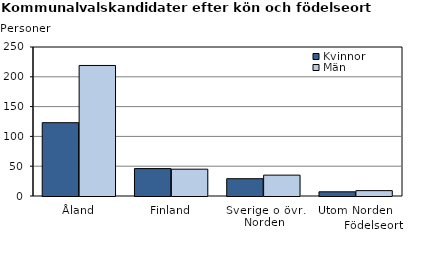
| Category | Kvinnor | Män |
|---|---|---|
| Åland | 123 | 219 |
| Finland | 46 | 45 |
| Sverige o övr. Norden | 29 | 35 |
| Utom Norden | 7 | 9 |